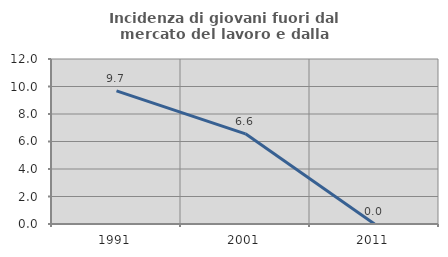
| Category | Incidenza di giovani fuori dal mercato del lavoro e dalla formazione  |
|---|---|
| 1991.0 | 9.677 |
| 2001.0 | 6.557 |
| 2011.0 | 0 |